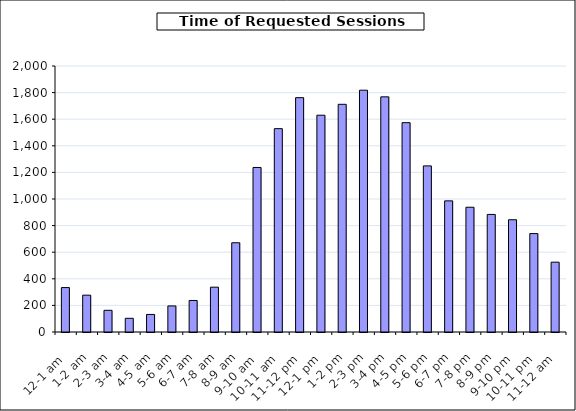
| Category | Series 0 |
|---|---|
| 12-1 am | 334 |
| 1-2 am | 277 |
| 2-3 am | 163 |
| 3-4 am | 103 |
| 4-5 am | 132 |
| 5-6 am | 196 |
| 6-7 am | 237 |
| 7-8 am | 337 |
| 8-9 am | 671 |
| 9-10 am | 1237 |
| 10-11 am | 1529 |
| 11-12 pm | 1762 |
| 12-1 pm | 1630 |
| 1-2 pm | 1712 |
| 2-3 pm | 1818 |
| 3-4 pm | 1768 |
| 4-5 pm | 1574 |
| 5-6 pm | 1249 |
| 6-7 pm | 986 |
| 7-8 pm | 938 |
| 8-9 pm | 884 |
| 9-10 pm | 844 |
| 10-11 pm | 740 |
| 11-12 am | 525 |